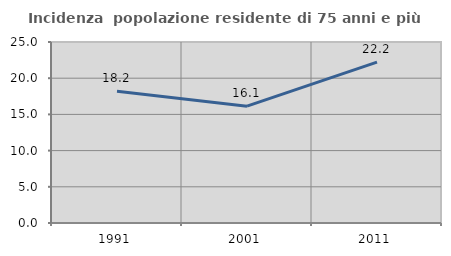
| Category | Incidenza  popolazione residente di 75 anni e più |
|---|---|
| 1991.0 | 18.207 |
| 2001.0 | 16.139 |
| 2011.0 | 22.222 |